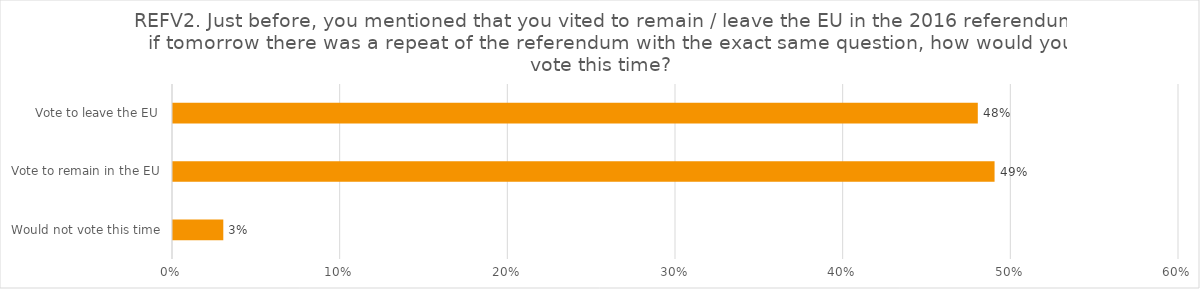
| Category | REFV2. Just before, you mentioned that you vited to remain / leave the EU in the 2016 referendum, if tomorrow there was a repeat of the referendum with the exact same question, how would you vote this time? |
|---|---|
| Would not vote this time | 0.03 |
| Vote to remain in the EU | 0.49 |
| Vote to leave the EU | 0.48 |